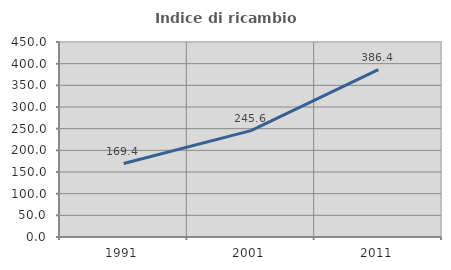
| Category | Indice di ricambio occupazionale  |
|---|---|
| 1991.0 | 169.444 |
| 2001.0 | 245.556 |
| 2011.0 | 386.364 |